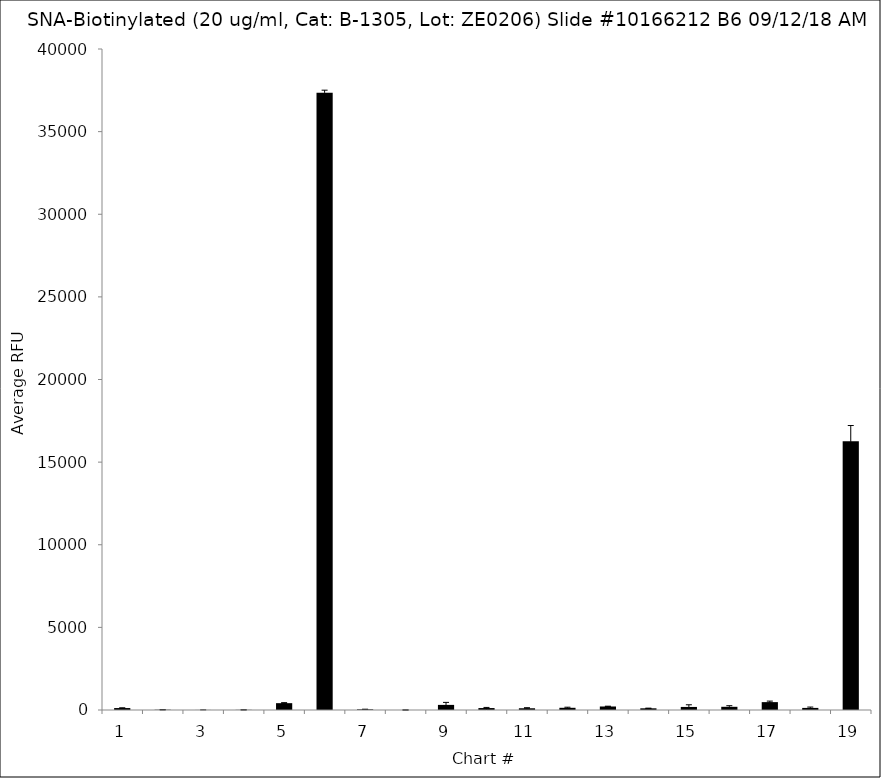
| Category | Series 0 |
|---|---|
| 1.0 | 117.75 |
| 2.0 | 15.5 |
| 3.0 | 3.25 |
| 4.0 | 8.75 |
| 5.0 | 413.75 |
| 6.0 | 37349.25 |
| 7.0 | 39.5 |
| 8.0 | 1 |
| 9.0 | 309 |
| 10.0 | 117.25 |
| 11.0 | 104.75 |
| 12.0 | 133.25 |
| 13.0 | 212.25 |
| 14.0 | 102.25 |
| 15.0 | 185.25 |
| 16.0 | 193.75 |
| 17.0 | 476.5 |
| 18.0 | 126.25 |
| 19.0 | 16259.5 |